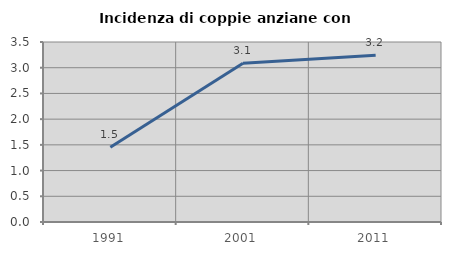
| Category | Incidenza di coppie anziane con figli |
|---|---|
| 1991.0 | 1.454 |
| 2001.0 | 3.085 |
| 2011.0 | 3.243 |